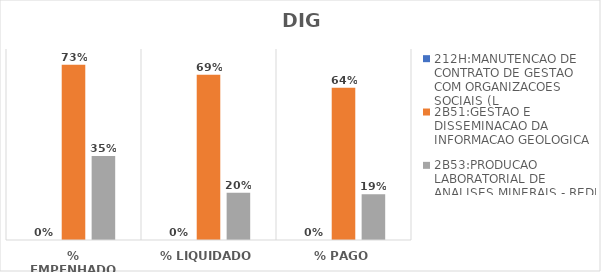
| Category | 212H:MANUTENCAO DE CONTRATO DE GESTAO COM ORGANIZACOES SOCIAIS (L | 2B51:GESTAO E DISSEMINACAO DA INFORMACAO GEOLOGICA | 2B53:PRODUCAO LABORATORIAL DE ANALISES MINERAIS - REDE LAMIN |
|---|---|---|---|
| % EMPENHADO | 0 | 0.734 | 0.352 |
| % LIQUIDADO | 0 | 0.692 | 0.198 |
| % PAGO | 0 | 0.638 | 0.192 |